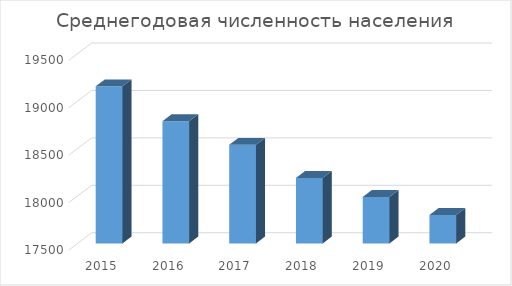
| Category | Среднегодовая численность населения |
|---|---|
| 2015.0 | 19156 |
| 2016.0 | 18789 |
| 2017.0 | 18540 |
| 2018.0 | 18190 |
| 2019.0 | 17990 |
| 2020.0 | 17800 |